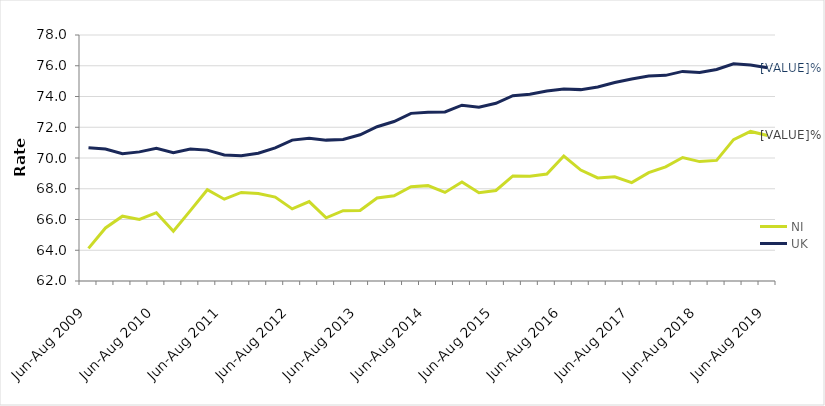
| Category | NI | UK |
|---|---|---|
| Jun-Aug 2009 | 64.122 | 70.661 |
| Sep-Nov 2009 | 65.451 | 70.579 |
| Dec-Feb 2010 | 66.217 | 70.28 |
| Mar-May 2010 | 66.009 | 70.398 |
| Jun-Aug 2010 | 66.442 | 70.639 |
| Sep-Nov 2010 | 65.232 | 70.339 |
| Dec-Feb 2011 | 66.574 | 70.586 |
| Mar-May 2011 | 67.937 | 70.512 |
| Jun-Aug 2011 | 67.32 | 70.195 |
| Sep-Nov 2011 | 67.762 | 70.145 |
| Dec-Feb 2012 | 67.69 | 70.313 |
| Mar-May 2012 | 67.458 | 70.66 |
| Jun-Aug 2012 | 66.691 | 71.164 |
| Sep-Nov 2012 | 67.167 | 71.29 |
| Dec-Feb 2013 | 66.112 | 71.163 |
| Mar-May 2013 | 66.574 | 71.205 |
| Jun-Aug 2013 | 66.587 | 71.509 |
| Sep-Nov 2013 | 67.397 | 72.034 |
| Dec-Feb 2014 | 67.54 | 72.373 |
| Mar-May 2014 | 68.133 | 72.903 |
| Jun-Aug 2014 | 68.203 | 72.974 |
| Sep-Nov 2014 | 67.762 | 72.993 |
| Dec-Feb 2015 | 68.44 | 73.433 |
| Mar-May 2015 | 67.744 | 73.309 |
| Jun-Aug 2015 | 67.887 | 73.559 |
| Sep-Nov 2015 | 68.833 | 74.049 |
| Dec-Feb 2016 | 68.816 | 74.14 |
| Mar-May 2016 | 68.959 | 74.357 |
| Jun-Aug 2016 | 70.127 | 74.486 |
| Sep-Nov 2016 | 69.214 | 74.447 |
| Dec-Feb 2017 | 68.706 | 74.624 |
| Mar-May 2017 | 68.774 | 74.909 |
| Jun-Aug 2017 | 68.402 | 75.138 |
| Sep-Nov 2017 | 69.045 | 75.338 |
| Dec-Feb 2018 | 69.419 | 75.375 |
| Mar-May 2018 | 70.029 | 75.632 |
| Jun-Aug 2018 | 69.765 | 75.557 |
| Sep-Nov 2018 | 69.845 | 75.761 |
| Dec-Feb 2019 | 71.196 | 76.127 |
| Mar-May 2019 | 71.727 | 76.049 |
| Jun-Aug 2019 | 71.467 | 75.874 |